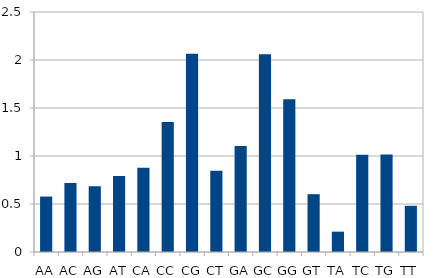
| Category | Series 0 |
|---|---|
| AA | 0.577 |
| AC | 0.718 |
| AG | 0.686 |
| AT | 0.791 |
| CA | 0.878 |
| CC | 1.355 |
| CG | 2.066 |
| CT | 0.848 |
| GA | 1.104 |
| GC | 2.061 |
| GG | 1.592 |
| GT | 0.602 |
| TA | 0.212 |
| TC | 1.013 |
| TG | 1.016 |
| TT | 0.481 |